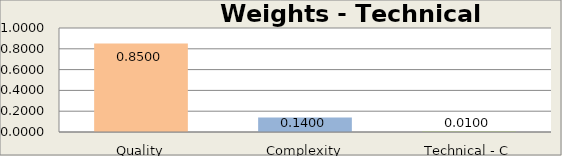
| Category | Technical Module |
|---|---|
| Quality | 0.85 |
| Complexity | 0.14 |
| Technical - C | 0.01 |